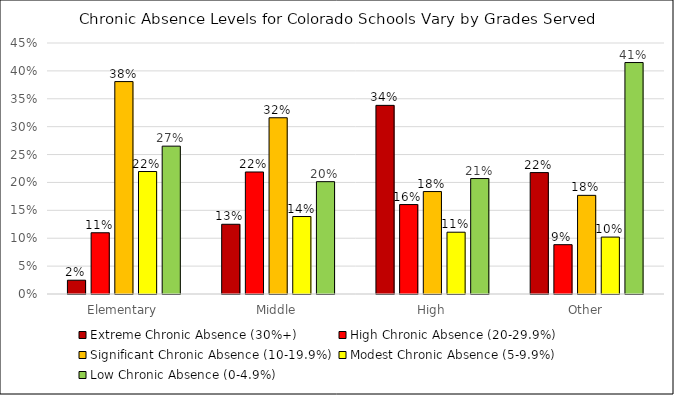
| Category | Extreme Chronic Absence (30%+) | High Chronic Absence (20-29.9%) | Significant Chronic Absence (10-19.9%) | Modest Chronic Absence (5-9.9%) | Low Chronic Absence (0-4.9%) |
|---|---|---|---|---|---|
| Elementary | 0.025 | 0.11 | 0.381 | 0.22 | 0.265 |
| Middle | 0.125 | 0.219 | 0.316 | 0.139 | 0.201 |
| High | 0.338 | 0.16 | 0.184 | 0.111 | 0.207 |
| Other | 0.218 | 0.088 | 0.177 | 0.102 | 0.415 |